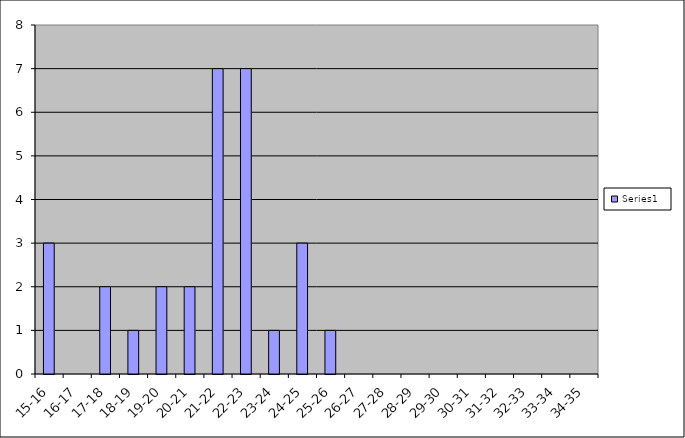
| Category | Series 0 |
|---|---|
| 15-16 | 3 |
| 16-17 | 0 |
| 17-18 | 2 |
| 18-19 | 1 |
| 19-20 | 2 |
| 20-21 | 2 |
| 21-22 | 7 |
| 22-23 | 7 |
| 23-24 | 1 |
| 24-25 | 3 |
| 25-26 | 1 |
| 26-27 | 0 |
| 27-28 | 0 |
| 28-29 | 0 |
| 29-30 | 0 |
| 30-31 | 0 |
| 31-32 | 0 |
| 32-33 | 0 |
| 33-34 | 0 |
| 34-35 | 0 |